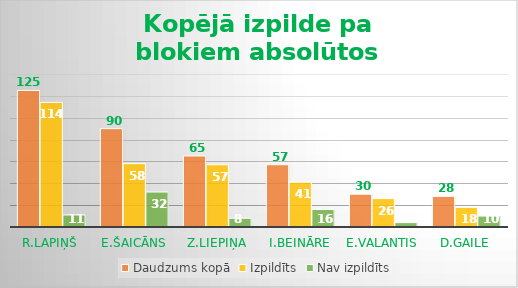
| Category | Daudzums kopā | Izpildīts | Nav izpildīts |
|---|---|---|---|
| R.Lapiņš | 125 | 114 | 11 |
| E.Šaicāns | 90 | 58 | 32 |
| Z.Liepiņa | 65 | 57 | 8 |
| I.Beināre | 57 | 41 | 16 |
| E.Valantis | 30 | 26 | 4 |
| D.Gaile | 28 | 18 | 10 |